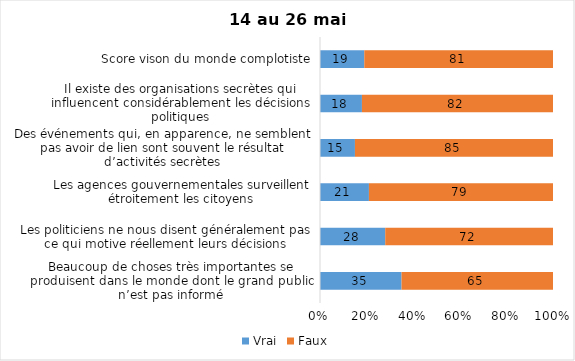
| Category | Vrai | Faux |
|---|---|---|
| Beaucoup de choses très importantes se produisent dans le monde dont le grand public n’est pas informé | 35 | 65 |
| Les politiciens ne nous disent généralement pas ce qui motive réellement leurs décisions | 28 | 72 |
| Les agences gouvernementales surveillent étroitement les citoyens | 21 | 79 |
| Des événements qui, en apparence, ne semblent pas avoir de lien sont souvent le résultat d’activités secrètes | 15 | 85 |
| Il existe des organisations secrètes qui influencent considérablement les décisions politiques | 18 | 82 |
| Score vison du monde complotiste | 19 | 81 |